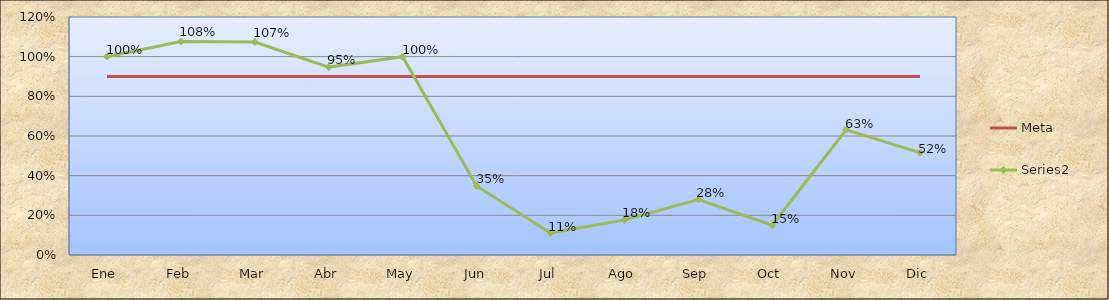
| Category | Meta | Series 2 |
|---|---|---|
| Ene | 0.9 | 1 |
| Feb | 0.9 | 1.077 |
| Mar | 0.9 | 1.074 |
| Abr | 0.9 | 0.947 |
| May | 0.9 | 1 |
| Jun | 0.9 | 0.348 |
| Jul | 0.9 | 0.111 |
| Ago | 0.9 | 0.176 |
| Sep | 0.9 | 0.28 |
| Oct | 0.9 | 0.15 |
| Nov | 0.9 | 0.632 |
| Dic | 0.9 | 0.516 |